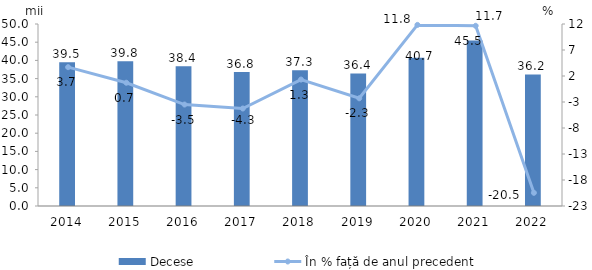
| Category | Decese |
|---|---|
| 2014.0 | 39.522 |
| 2015.0 | 39.8 |
| 2016.0 | 38.412 |
| 2017.0 | 36.779 |
| 2018.0 | 37.263 |
| 2019.0 | 36.411 |
| 2020.0 | 40.717 |
| 2021.0 | 45.462 |
| 2022.0 | 36.157 |